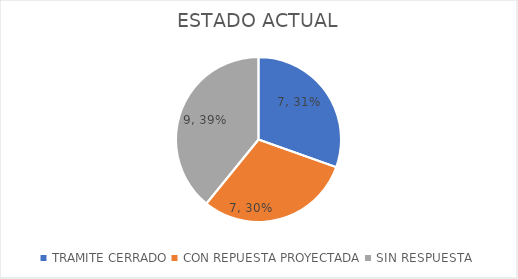
| Category | Series 0 |
|---|---|
| TRAMITE CERRADO | 7 |
| CON REPUESTA PROYECTADA | 7 |
| SIN RESPUESTA | 9 |